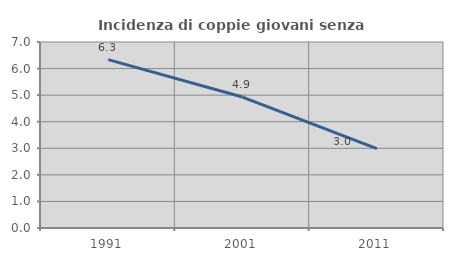
| Category | Incidenza di coppie giovani senza figli |
|---|---|
| 1991.0 | 6.335 |
| 2001.0 | 4.928 |
| 2011.0 | 2.99 |